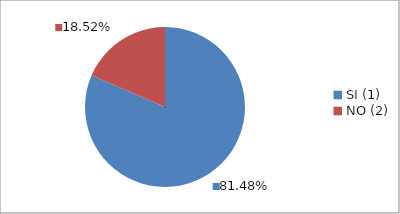
| Category | Series 0 |
|---|---|
| SI (1) | 0.815 |
| NO (2) | 0.185 |